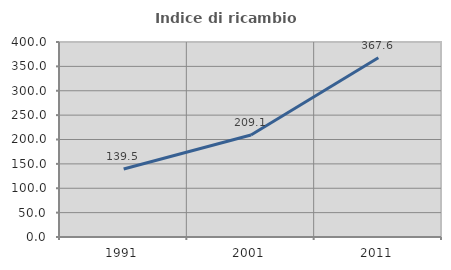
| Category | Indice di ricambio occupazionale  |
|---|---|
| 1991.0 | 139.535 |
| 2001.0 | 209.091 |
| 2011.0 | 367.568 |